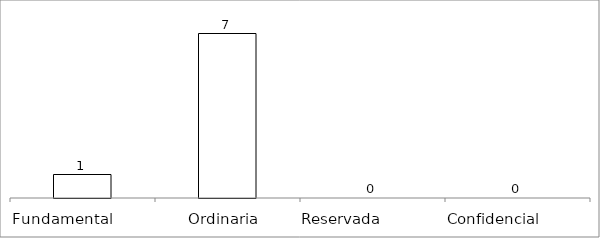
| Category | Series 0 |
|---|---|
| Fundamental         | 1 |
| Ordinaria  | 7 |
| Reservada               | 0 |
| Confidencial             | 0 |